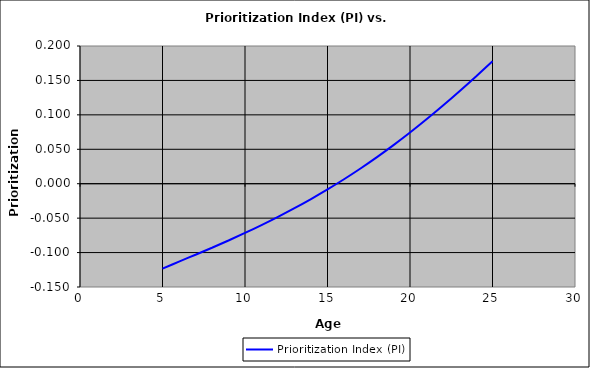
| Category | Prioritization Index (PI) |
|---|---|
| 5.0 | -0.123 |
| 6.0 | -0.113 |
| 7.0 | -0.103 |
| 8.0 | -0.093 |
| 9.0 | -0.082 |
| 10.0 | -0.071 |
| 11.0 | -0.06 |
| 12.0 | -0.048 |
| 13.0 | -0.035 |
| 14.0 | -0.022 |
| 15.0 | -0.008 |
| 16.0 | 0.006 |
| 17.0 | 0.022 |
| 18.0 | 0.039 |
| 19.0 | 0.056 |
| 20.0 | 0.074 |
| 21.0 | 0.094 |
| 22.0 | 0.114 |
| 23.0 | 0.134 |
| 24.0 | 0.156 |
| 25.0 | 0.178 |